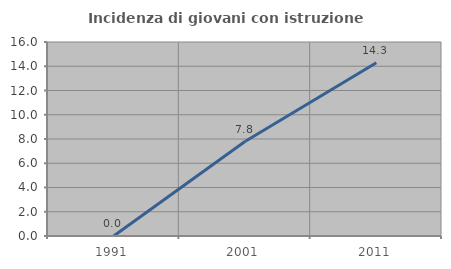
| Category | Incidenza di giovani con istruzione universitaria |
|---|---|
| 1991.0 | 0 |
| 2001.0 | 7.792 |
| 2011.0 | 14.286 |